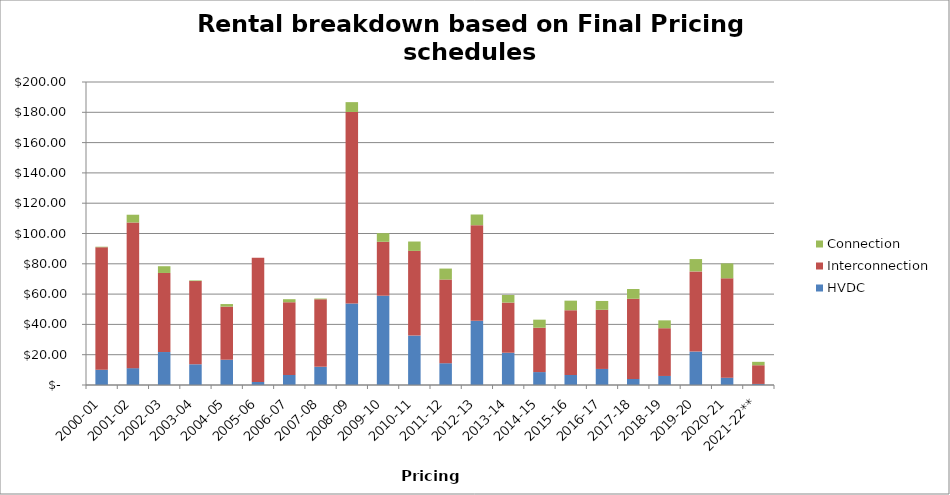
| Category | HVDC | Interconnection | Connection |
|---|---|---|---|
| 2000-01 | 10107172.405 | 80837696.501 | 334766.985 |
| 2001-02 | 11132118.637 | 96104336.654 | 5155913.203 |
| 2002-03 | 21761105.86 | 52185400.13 | 4453886.29 |
| 2003-04 | 13666754.82 | 54922823.94 | 435246.9 |
| 2004-05 | 16692662.28 | 35052676.4 | 1691088.41 |
| 2005-06 | 2040558.16 | 81964750.24 | -2010080.37 |
| 2006-07 | 6641296.74 | 47990317.55 | 2003459.4 |
| 2007-08 | 11964706.58 | 44591766.5 | 505691.53 |
| 2008-09 | 53848997.88 | 126369371.98 | 6487766.28 |
| 2009-10 | 58940519.824 | 35590326.105 | 5689705.548 |
| 2010-11 | 32614295.7 | 55921174.98 | 6171732.43 |
| 2011-12 | 14379630.83 | 55222388.39 | 7247443.54 |
| 2012-13 | 42348232.27 | 63131769.14 | 7058872.95 |
| 2013-14 | 21314707.47 | 33095050.52 | 5002701.44 |
| 2014-15 | 8522007.31 | 29282732.01 | 5321866.48 |
| 2015-16 | 6597806.94 | 42750338.2 | 6325976.32 |
| 2016-17 | 10595273.21 | 39050433.1 | 5828589.74 |
| 2017-18 | 3975099.71 | 52943929.15 | 6431100.25 |
| 2018-19 | 5962060.43 | 31519739.76 | 5184477.6 |
| 2019-20 | 22069028.29 | 52923971 | 8133597.83 |
| 2020-21 | 4818781.03 | 65597777.91 | 9851496.42 |
| 2021-22** | 693199.86 | 12353697.38 | 2249907.29 |